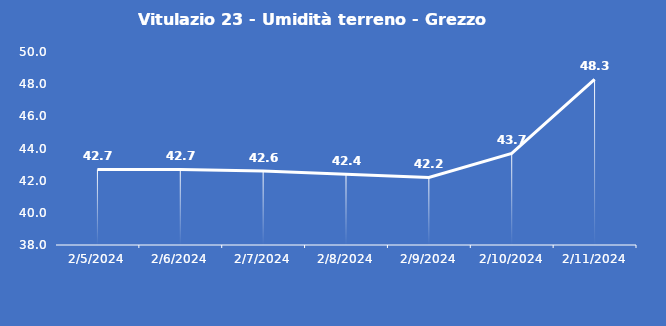
| Category | Vitulazio 23 - Umidità terreno - Grezzo (%VWC) |
|---|---|
| 2/5/24 | 42.7 |
| 2/6/24 | 42.7 |
| 2/7/24 | 42.6 |
| 2/8/24 | 42.4 |
| 2/9/24 | 42.2 |
| 2/10/24 | 43.7 |
| 2/11/24 | 48.3 |